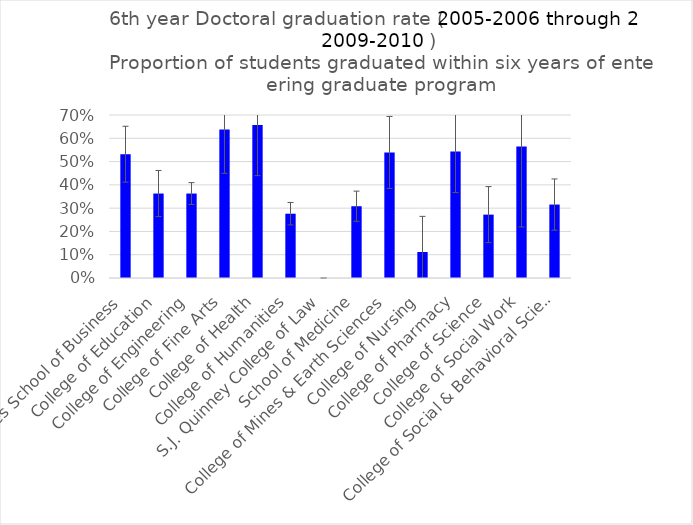
| Category | Series 0 |
|---|---|
| David Eccles School of Business | 0.532 |
| College of Education | 0.363 |
| College of Engineering | 0.363 |
| College of Fine Arts | 0.637 |
| College of Health | 0.657 |
| College of Humanities | 0.276 |
| S.J. Quinney College of Law | 0 |
| School of Medicine | 0.308 |
| College of Mines & Earth Sciences | 0.539 |
| College of Nursing | 0.112 |
| College of Pharmacy | 0.544 |
| College of Science | 0.272 |
| College of Social Work | 0.564 |
| College of Social & Behavioral Science | 0.315 |